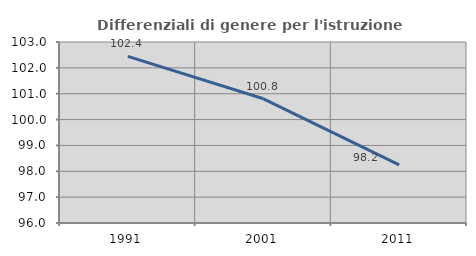
| Category | Differenziali di genere per l'istruzione superiore |
|---|---|
| 1991.0 | 102.443 |
| 2001.0 | 100.804 |
| 2011.0 | 98.248 |